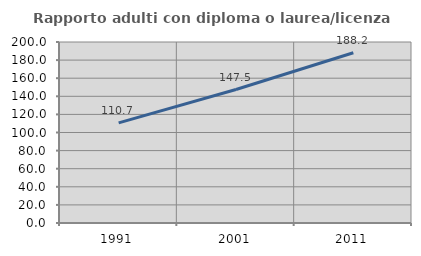
| Category | Rapporto adulti con diploma o laurea/licenza media  |
|---|---|
| 1991.0 | 110.676 |
| 2001.0 | 147.467 |
| 2011.0 | 188.166 |